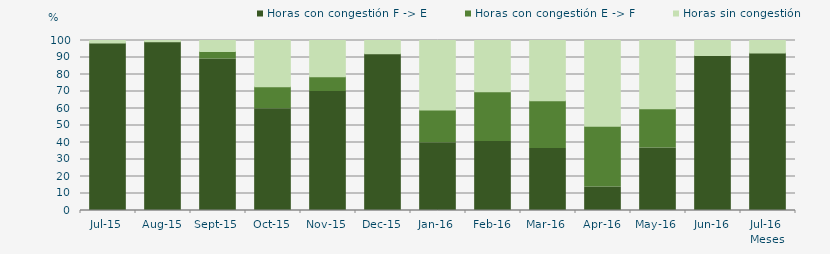
| Category | Horas con congestión F -> E | Horas con congestión E -> F | Horas sin congestión |
|---|---|---|---|
| 2015-07-01 | 98.522 | 0 | 1.478 |
| 2015-08-01 | 99.328 | 0 | 0.672 |
| 2015-09-01 | 89.167 | 4.306 | 6.528 |
| 2015-10-01 | 59.823 | 12.903 | 27.274 |
| 2015-11-01 | 70 | 8.75 | 21.25 |
| 2015-12-01 | 92.204 | 0 | 7.796 |
| 2016-01-01 | 39.919 | 19.22 | 40.86 |
| 2016-02-01 | 40.661 | 29.167 | 30.172 |
| 2016-03-01 | 36.507 | 28.091 | 35.402 |
| 2016-04-01 | 13.889 | 35.694 | 50.417 |
| 2016-05-01 | 36.828 | 22.984 | 40.188 |
| 2016-06-01 | 91.111 | 0 | 8.889 |
| 2016-07-01 | 92.608 | 0 | 7.392 |